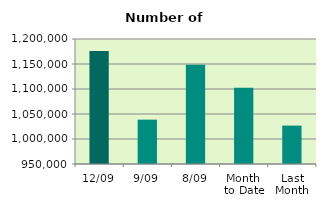
| Category | Series 0 |
|---|---|
| 12/09 | 1176138 |
| 9/09 | 1038692 |
| 8/09 | 1148318 |
| Month 
to Date | 1102323.25 |
| Last
Month | 1026775.304 |